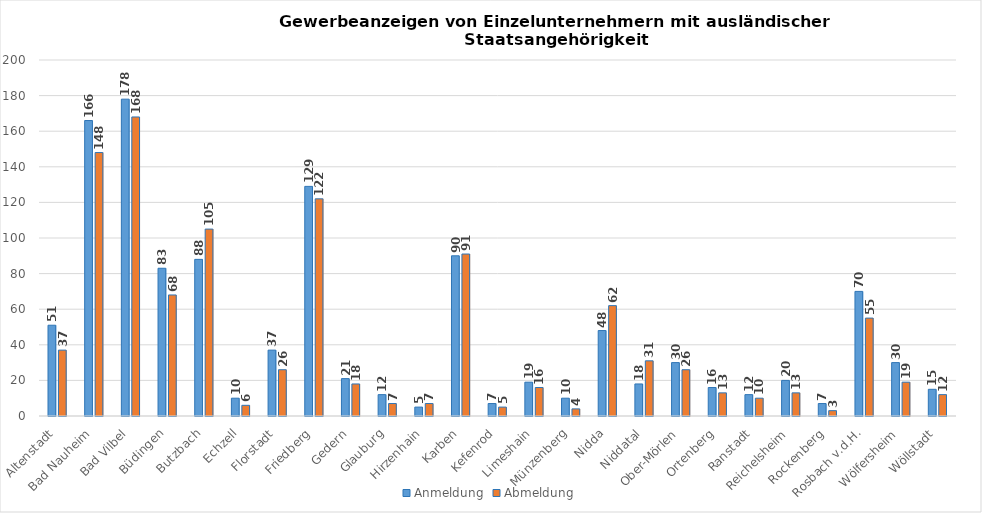
| Category | Anmeldung | Abmeldung |
|---|---|---|
| Altenstadt | 51 | 37 |
| Bad Nauheim | 166 | 148 |
| Bad Vilbel | 178 | 168 |
| Büdingen | 83 | 68 |
| Butzbach | 88 | 105 |
| Echzell | 10 | 6 |
| Florstadt | 37 | 26 |
| Friedberg | 129 | 122 |
| Gedern | 21 | 18 |
| Glauburg | 12 | 7 |
| Hirzenhain | 5 | 7 |
| Karben | 90 | 91 |
| Kefenrod | 7 | 5 |
| Limeshain | 19 | 16 |
| Münzenberg | 10 | 4 |
| Nidda | 48 | 62 |
| Niddatal | 18 | 31 |
| Ober-Mörlen | 30 | 26 |
| Ortenberg | 16 | 13 |
| Ranstadt | 12 | 10 |
| Reichelsheim | 20 | 13 |
| Rockenberg | 7 | 3 |
| Rosbach v.d.H. | 70 | 55 |
| Wölfersheim | 30 | 19 |
| Wöllstadt | 15 | 12 |